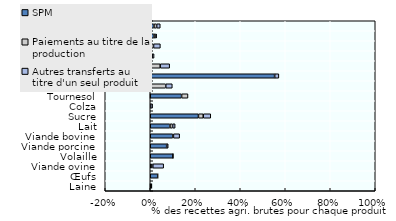
| Category | SPM | Paiements au titre de la production | Autres transferts au titre d'un seul produit |
|---|---|---|---|
| Laine | 0 | 0.006 | 0 |
| Œufs | 0.033 | 0.001 | 0 |
| Viande ovine | 0.005 | 0.006 | 0.048 |
| Volaille | 0.101 | 0 | 0 |
| Viande porcine | 0.073 | 0 | 0.007 |
| Viande bovine | 0.1 | 0.003 | 0.028 |
| Lait | 0.088 | 0.012 | 0.011 |
| Sucre | 0.214 | 0.021 | 0.033 |
| Colza | 0.002 | 0 | 0.009 |
| Tournesol | 0.139 | 0.028 | 0 |
| Soja | 0.005 | 0.064 | 0.029 |
| Riz | 0.553 | 0 | 0.019 |
| Sorgho | 0 | 0.044 | 0.042 |
| Avoine | 0.007 | 0.002 | 0.008 |
| Maïs | 0.002 | 0.012 | 0.03 |
| Orge | 0.017 | 0.008 | 0.003 |
| Blé | 0.017 | 0.012 | 0.016 |